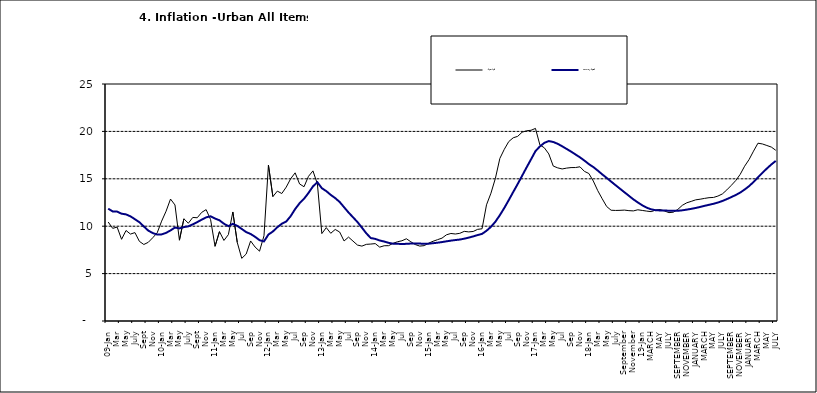
| Category | Year-on Rate | 12-Month Average |
|---|---|---|
| 09-Jan | 10.439 | 11.844 |
| Feb | 9.772 | 11.562 |
| Mar | 9.907 | 11.538 |
| Apr | 8.618 | 11.319 |
| May | 9.547 | 11.246 |
| June | 9.17 | 11.039 |
| July | 9.325 | 10.738 |
| Aug | 8.401 | 10.424 |
| Sept | 8.07 | 9.973 |
| Oct | 8.3 | 9.535 |
| Nov | 8.781 | 9.278 |
| Dec | 9.298 | 9.117 |
| 10-Jan | 10.534 | 9.136 |
| Feb | 11.584 | 9.297 |
| Mar | 12.864 | 9.555 |
| Apr | 12.24 | 9.859 |
| May | 8.524 | 9.769 |
| June | 10.781 | 9.904 |
| July | 10.313 | 9.987 |
| Aug | 10.924 | 10.197 |
| Sept | 10.891 | 10.43 |
| Oct | 11.457 | 10.689 |
| Nov | 11.748 | 10.932 |
| Dec | 10.699 | 11.042 |
| 11-Jan | 7.878 | 10.806 |
| Feb | 9.426 | 10.623 |
| Mar | 8.498 | 10.26 |
| Apr | 9.11 | 10.005 |
| May | 11.5 | 10.249 |
| Jun | 8.278 | 10.034 |
| Jul | 6.608 | 9.711 |
| Aug | 7.061 | 9.38 |
| Sep | 8.443 | 9.178 |
| Oct | 7.802 | 8.88 |
| Nov | 7.365 | 8.525 |
| Dec | 8.993 | 8.395 |
| 12-Jan | 16.445 | 9.119 |
| Feb | 13.123 | 9.443 |
| Mar | 13.701 | 9.889 |
| Apr | 13.447 | 10.259 |
| May | 14.127 | 10.496 |
| Jun | 15.012 | 11.062 |
| Jul | 15.63 | 11.81 |
| Aug | 14.456 | 12.422 |
| Sep | 14.162 | 12.893 |
| Oct | 15.26 | 13.506 |
| Nov | 15.836 | 14.199 |
| Dec | 14.459 | 14.637 |
| 13-Jan | 9.22 | 14.006 |
| Feb | 9.85 | 13.703 |
| Mar | 9.253 | 13.302 |
| Apr | 9.657 | 12.966 |
| May | 9.385 | 12.557 |
| Jun | 8.441 | 11.999 |
| Jul | 8.849 | 11.443 |
| Aug | 8.431 | 10.946 |
| Sep | 8.013 | 10.44 |
| Oct | 7.9 | 9.849 |
| Nov | 8.086 | 9.245 |
| Dec | 8.117 | 8.75 |
| 14-Jan | 8.164 | 8.662 |
| Feb | 7.791 | 8.493 |
| Mar | 7.937 | 8.384 |
| Apr | 7.947 | 8.246 |
| May | 8.195 | 8.151 |
| Jun | 8.358 | 8.146 |
| Jul | 8.464 | 8.118 |
| Aug | 8.673 | 8.141 |
| Sep | 8.357 | 8.17 |
| Oct | 8.064 | 8.182 |
| Nov | 7.902 | 8.165 |
| Dec | 7.948 | 8.151 |
| 15-Jan | 8.211 | 8.155 |
| Feb | 8.412 | 8.206 |
| Mar | 8.579 | 8.26 |
| Apr | 8.742 | 8.326 |
| May | 9.092 | 8.403 |
| Jun | 9.232 | 8.478 |
| Jul | 9.177 | 8.54 |
| Aug | 9.25 | 8.591 |
| Sep | 9.455 | 8.684 |
| Oct | 9.398 | 8.795 |
| Nov | 9.442 | 8.922 |
| Dec | 9.665 | 9.064 |
| 16-Jan | 9.728 | 9.19 |
| Feb | 12.254 | 9.516 |
| Mar | 13.485 | 9.935 |
| Apr | 15.052 | 10.474 |
| May | 17.148 | 11.165 |
| Jun | 18.111 | 11.925 |
| Jul | 18.927 | 12.754 |
| Aug | 19.325 | 13.605 |
| Sep | 19.476 | 14.444 |
| Oct | 19.914 | 15.318 |
| Nov | 20.067 | 16.193 |
| Dec | 20.118 | 17.05 |
| 17-Jan | 20.315 | 17.914 |
| Feb | 18.569 | 18.418 |
| Mar | 18.27 | 18.794 |
| Apr | 17.621 | 18.982 |
| May | 16.343 | 18.883 |
| Jun | 16.153 | 18.692 |
| Jul | 16.038 | 18.43 |
| Aug | 16.128 | 18.151 |
| Sep | 16.183 | 17.872 |
| Oct | 16.187 | 17.567 |
| Nov | 16.267 | 17.264 |
| Dec | 15.785 | 16.921 |
| 18-Jan | 15.559 | 16.55 |
| Feb | 14.763 | 16.241 |
| Mar | 13.748 | 15.866 |
| Apr | 12.893 | 15.468 |
| May | 12.077 | 15.096 |
| June | 11.683 | 14.706 |
| July | 11.661 | 14.329 |
| August | 11.673 | 13.951 |
| September | 11.697 | 13.578 |
| October | 11.64 | 13.206 |
| November | 11.615 | 12.831 |
| December | 11.731 | 12.509 |
| 19-Jan | 11.664 | 12.203 |
| February | 11.592 | 11.954 |
| MARCH | 11.535 | 11.78 |
| APRIL | 11.696 | 11.686 |
| MAY | 11.756 | 11.662 |
| JUNE | 11.605 | 11.655 |
| JULY | 11.432 | 11.635 |
| AUGUST | 11.479 | 11.618 |
| SEPTEMBER | 11.776 | 11.626 |
| OCTOBER | 12.202 | 11.676 |
| NOVEMBER | 12.469 | 11.75 |
| DECEMBER | 12.617 | 11.827 |
| JANUARY | 12.779 | 11.923 |
| FEBRUARY | 12.847 | 12.03 |
| MARCH | 12.932 | 12.147 |
| APRIL | 13.008 | 12.258 |
| MAY | 13.033 | 12.365 |
| JUNE | 13.178 | 12.496 |
| JULY | 13.403 | 12.659 |
| AUGUST | 13.827 | 12.855 |
| SEPTEMBER | 14.306 | 13.068 |
| OCTOBER | 14.811 | 13.289 |
| NOVEMBER | 15.466 | 13.546 |
| DECEMBER | 16.327 | 13.864 |
| JANUARY | 17.03 | 14.228 |
| FEBRUARY | 17.918 | 14.66 |
| MARCH | 18.756 | 15.154 |
| APRIL | 18.675 | 15.63 |
| MAY | 18.514 | 16.086 |
| JUNE | 18.348 | 16.512 |
| JULY | 18.007 | 16.886 |